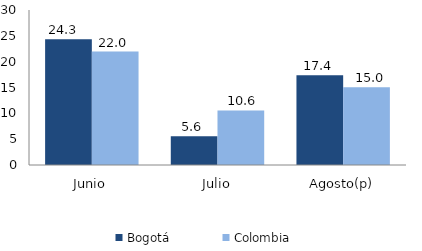
| Category | Bogotá | Colombia |
|---|---|---|
| Junio | 24.329 | 21.956 |
| Julio | 5.57 | 10.565 |
| Agosto(p) | 17.374 | 15.034 |